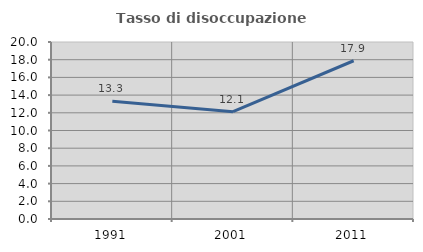
| Category | Tasso di disoccupazione giovanile  |
|---|---|
| 1991.0 | 13.3 |
| 2001.0 | 12.121 |
| 2011.0 | 17.881 |